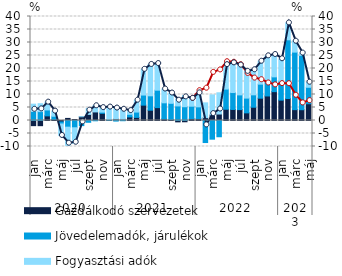
| Category | Gazdálkodó szervezetek | Jövedelemadók, járulékok | Fogyasztási adók |
|---|---|---|---|
| 0 | -1.976 | 3.45 | 2.832 |
| 1 | -1.989 | 3.421 | 3.038 |
| 2 | 1.781 | 2.274 | 3.006 |
| 3 | 0.406 | 1.231 | 1.975 |
| 4 | -0.559 | -0.78 | -4.415 |
| 5 | 0.801 | -2.564 | -6.973 |
| 6 | 0.384 | -2.793 | -5.955 |
| 7 | 1.44 | -1.969 | 0.018 |
| 8 | 2.347 | -0.689 | 2.308 |
| 9 | 3.295 | -0.11 | 2.486 |
| 10 | 2.762 | 0.464 | 1.731 |
| 11 | 0.106 | 0.255 | 4.802 |
| 12 | 0.572 | -0.223 | 4.439 |
| 13 | 0.497 | -0.084 | 3.905 |
| 14 | 1.377 | 1.005 | 1.427 |
| 15 | 1.191 | 2.054 | 4.574 |
| 16 | 5.907 | 3.881 | 9.892 |
| 17 | 3.958 | 5.539 | 12.065 |
| 18 | 4.954 | 6.711 | 10.241 |
| 19 | 0.574 | 6.229 | 5.305 |
| 20 | 0.349 | 6.26 | 3.958 |
| 21 | -0.523 | 5.599 | 2.731 |
| 22 | -0.486 | 5.299 | 4.279 |
| 23 | 0.721 | 4.777 | 3.018 |
| 24 | 0.722 | 4.531 | 5.37 |
| 25 | 1.09 | -8.475 | 5.696 |
| 26 | 2.117 | -7.185 | 7.726 |
| 27 | 2.491 | -6.25 | 8.175 |
| 28 | 4.337 | 7.75 | 9.398 |
| 29 | 4.249 | 6.505 | 11.421 |
| 30 | 4.188 | 5.661 | 11.44 |
| 31 | 2.939 | 5.682 | 10.271 |
| 32 | 5.106 | 4.763 | 9.651 |
| 33 | 8.585 | 5.392 | 8.817 |
| 34 | 9.439 | 5.469 | 9.966 |
| 35 | 11.094 | 5.687 | 8.608 |
| 36 | 7.833 | 7.262 | 8.65 |
| 37 | 8.447 | 22.593 | 6.5 |
| 38 | 4.176 | 22.123 | 4.195 |
| 39 | 4.148 | 20.9 | 0.883 |
| 40 | 6.44 | 6.336 | 1.953 |